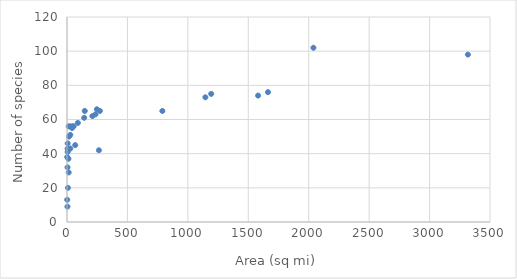
| Category | Series 0 |
|---|---|
| 3317.0 | 98 |
| 2039.0 | 102 |
| 1581.0 | 74 |
| 1145.0 | 73 |
| 236.0 | 63 |
| 142.0 | 61 |
| 90.0 | 58 |
| 27.0 | 51 |
| 5.4 | 41 |
| 789.0 | 65 |
| 272.0 | 65 |
| 210.0 | 62 |
| 42.0 | 55 |
| 26.5 | 56 |
| 247.0 | 66 |
| 55.0 | 56 |
| 147.0 | 65 |
| 47.0 | 56 |
| 1663.0 | 76 |
| 1193.0 | 75 |
| 68.0 | 45 |
| 28.0 | 43 |
| 16.0 | 50 |
| 14.0 | 29 |
| 13.6 | 56 |
| 11.8 | 37 |
| 5.66 | 46 |
| 5.0 | 43 |
| 4.3 | 32 |
| 1.9 | 38 |
| 1.56 | 13 |
| 264.0 | 42 |
| 7.6 | 20 |
| 3.7 | 9 |